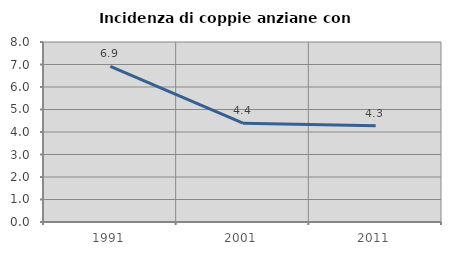
| Category | Incidenza di coppie anziane con figli |
|---|---|
| 1991.0 | 6.915 |
| 2001.0 | 4.39 |
| 2011.0 | 4.274 |